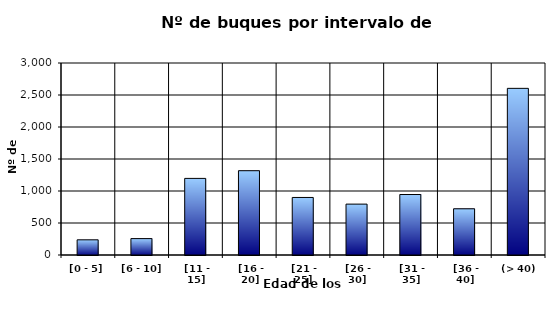
| Category | [0 - 5] |
|---|---|
| [0 - 5] | 237 |
|  [6 - 10] | 256 |
|  [11 - 15] | 1197 |
|  [16 - 20] | 1317 |
|  [21 - 25] | 899 |
|  [26 - 30] | 795 |
|  [31 - 35] | 945 |
|  [36 - 40] | 722 |
|  (> 40) | 2604 |